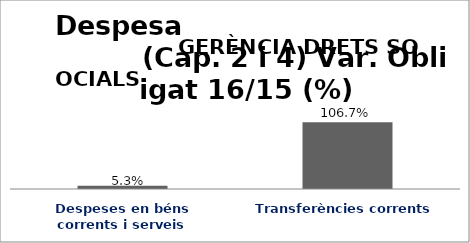
| Category | Series 0 |
|---|---|
| Despeses en béns corrents i serveis | 0.053 |
| Transferències corrents | 1.067 |